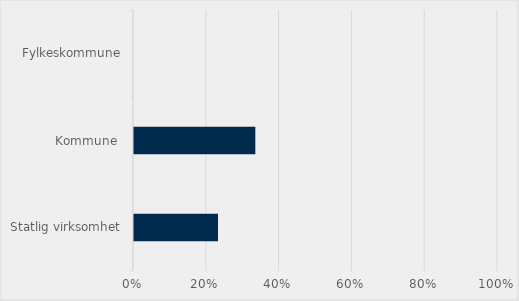
| Category | Prosent |
|---|---|
| Statlig virksomhet | 0.231 |
| Kommune  | 0.333 |
| Fylkeskommune | 0 |